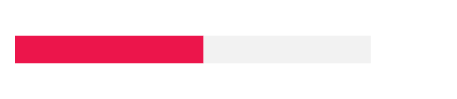
| Category | Series 0 | Series 1 |
|---|---|---|
| 0 | 0.53 | 0.47 |